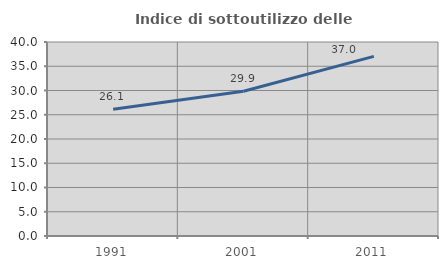
| Category | Indice di sottoutilizzo delle abitazioni  |
|---|---|
| 1991.0 | 26.135 |
| 2001.0 | 29.852 |
| 2011.0 | 37.044 |